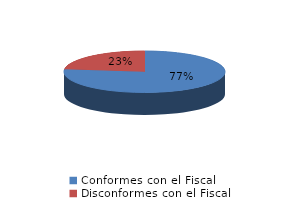
| Category | Series 0 |
|---|---|
| 0 | 474 |
| 1 | 143 |